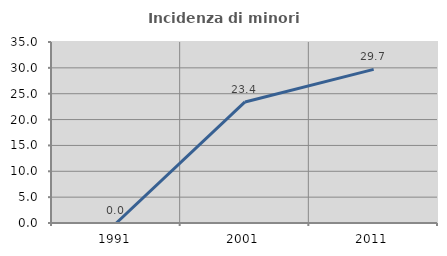
| Category | Incidenza di minori stranieri |
|---|---|
| 1991.0 | 0 |
| 2001.0 | 23.404 |
| 2011.0 | 29.709 |